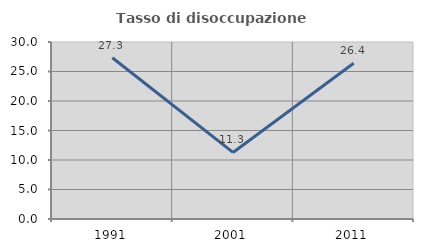
| Category | Tasso di disoccupazione giovanile  |
|---|---|
| 1991.0 | 27.338 |
| 2001.0 | 11.282 |
| 2011.0 | 26.389 |